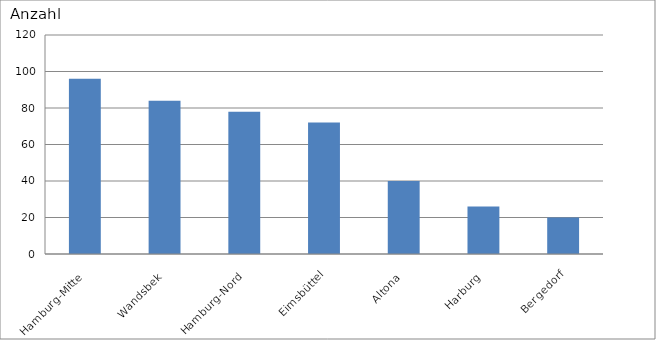
| Category | Hamburg-Mitte |
|---|---|
| Hamburg-Mitte | 96 |
| Wandsbek | 84 |
| Hamburg-Nord | 78 |
| Eimsbüttel | 72 |
| Altona | 40 |
| Harburg | 26 |
| Bergedorf | 20 |